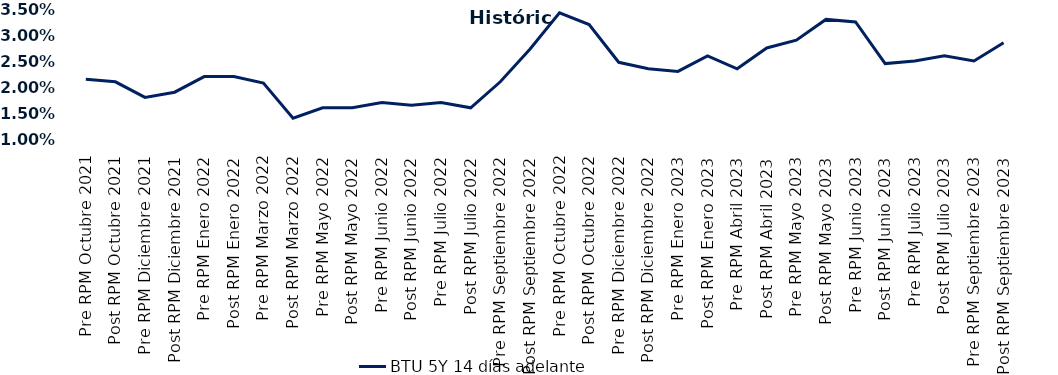
| Category | BTU 5Y 14 días adelante |
|---|---|
| Pre RPM Octubre 2021 | 0.022 |
| Post RPM Octubre 2021 | 0.021 |
| Pre RPM Diciembre 2021 | 0.018 |
| Post RPM Diciembre 2021 | 0.019 |
| Pre RPM Enero 2022 | 0.022 |
| Post RPM Enero 2022 | 0.022 |
| Pre RPM Marzo 2022 | 0.021 |
| Post RPM Marzo 2022 | 0.014 |
| Pre RPM Mayo 2022 | 0.016 |
| Post RPM Mayo 2022 | 0.016 |
| Pre RPM Junio 2022 | 0.017 |
| Post RPM Junio 2022 | 0.016 |
| Pre RPM Julio 2022 | 0.017 |
| Post RPM Julio 2022 | 0.016 |
| Pre RPM Septiembre 2022 | 0.021 |
| Post RPM Septiembre 2022 | 0.027 |
| Pre RPM Octubre 2022 | 0.034 |
| Post RPM Octubre 2022 | 0.032 |
| Pre RPM Diciembre 2022 | 0.025 |
| Post RPM Diciembre 2022 | 0.024 |
| Pre RPM Enero 2023 | 0.023 |
| Post RPM Enero 2023 | 0.026 |
| Pre RPM Abril 2023 | 0.024 |
| Post RPM Abril 2023 | 0.028 |
| Pre RPM Mayo 2023 | 0.029 |
| Post RPM Mayo 2023 | 0.033 |
| Pre RPM Junio 2023 | 0.032 |
| Post RPM Junio 2023 | 0.024 |
| Pre RPM Julio 2023 | 0.025 |
| Post RPM Julio 2023 | 0.026 |
| Pre RPM Septiembre 2023 | 0.025 |
| Post RPM Septiembre 2023 | 0.028 |